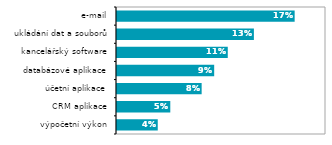
| Category | Series 0 |
|---|---|
| výpočetní výkon | 0.039 |
| CRM aplikace | 0.051 |
| účetní aplikace | 0.081 |
| databázové aplikace | 0.093 |
| kancelářský software | 0.106 |
| ukládání dat a souborů | 0.131 |
| e-mail | 0.17 |